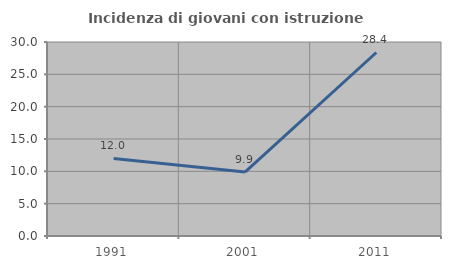
| Category | Incidenza di giovani con istruzione universitaria |
|---|---|
| 1991.0 | 12 |
| 2001.0 | 9.89 |
| 2011.0 | 28.378 |